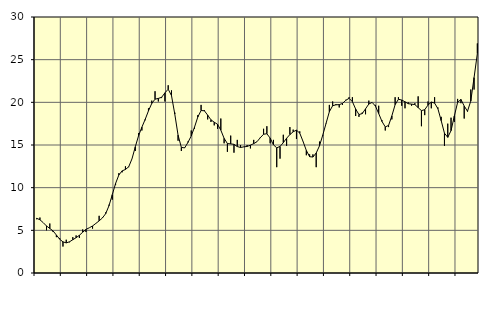
| Category | Piggar | Series 1 |
|---|---|---|
| nan | 6.3 | 6.41 |
| 87.0 | 6.5 | 6.24 |
| 87.0 | 5.9 | 5.9 |
| 87.0 | 5 | 5.51 |
| nan | 5.8 | 5.22 |
| 88.0 | 4.8 | 4.93 |
| 88.0 | 4.2 | 4.45 |
| 88.0 | 4.1 | 3.96 |
| nan | 3.1 | 3.65 |
| 89.0 | 3.9 | 3.53 |
| 89.0 | 3.6 | 3.66 |
| 89.0 | 4.2 | 3.9 |
| nan | 4.4 | 4.14 |
| 90.0 | 4.1 | 4.42 |
| 90.0 | 5.1 | 4.78 |
| 90.0 | 4.8 | 5.11 |
| nan | 5.3 | 5.3 |
| 91.0 | 5.2 | 5.51 |
| 91.0 | 5.8 | 5.81 |
| 91.0 | 6.7 | 6.11 |
| nan | 6.5 | 6.45 |
| 92.0 | 7.1 | 6.96 |
| 92.0 | 8 | 7.89 |
| 92.0 | 8.6 | 9.18 |
| nan | 10.3 | 10.49 |
| 93.0 | 11.7 | 11.49 |
| 93.0 | 11.8 | 11.97 |
| 93.0 | 12.5 | 12.13 |
| nan | 12.4 | 12.45 |
| 94.0 | 13.4 | 13.39 |
| 94.0 | 14.3 | 14.79 |
| 94.0 | 16.4 | 16.1 |
| nan | 16.7 | 17.09 |
| 95.0 | 17.9 | 18 |
| 95.0 | 19.3 | 19 |
| 95.0 | 20.2 | 19.87 |
| nan | 21.3 | 20.37 |
| 96.0 | 20.1 | 20.46 |
| 96.0 | 20.5 | 20.59 |
| 96.0 | 20.1 | 21.11 |
| nan | 22 | 21.54 |
| 97.0 | 21.4 | 20.79 |
| 97.0 | 18.8 | 18.63 |
| 97.0 | 15.5 | 16.15 |
| nan | 14.3 | 14.72 |
| 98.0 | 14.7 | 14.66 |
| 98.0 | 15.4 | 15.3 |
| 98.0 | 16.7 | 16.06 |
| nan | 16.9 | 17.09 |
| 99.0 | 18.5 | 18.28 |
| 99.0 | 19.7 | 19.04 |
| 99.0 | 19.1 | 19.01 |
| nan | 18 | 18.5 |
| 0.0 | 17.7 | 17.95 |
| 0.0 | 17.3 | 17.67 |
| 0.0 | 16.9 | 17.43 |
| nan | 18.1 | 16.74 |
| 1.0 | 15.2 | 15.78 |
| 1.0 | 14.2 | 15.17 |
| 1.0 | 16.1 | 15.13 |
| nan | 14.1 | 15.08 |
| 2.0 | 15.6 | 14.82 |
| 2.0 | 15 | 14.71 |
| 2.0 | 14.8 | 14.78 |
| nan | 15 | 14.83 |
| 3.0 | 14.6 | 14.98 |
| 3.0 | 15.6 | 15.16 |
| 3.0 | 15.4 | 15.39 |
| nan | 15.9 | 15.85 |
| 4.0 | 16.9 | 16.26 |
| 4.0 | 17.2 | 16.32 |
| 4.0 | 15.2 | 15.81 |
| nan | 15.6 | 15.02 |
| 5.0 | 12.4 | 14.67 |
| 5.0 | 13.4 | 14.83 |
| 5.0 | 16.2 | 15.27 |
| nan | 14.9 | 15.79 |
| 6.0 | 17.1 | 16.22 |
| 6.0 | 16.8 | 16.55 |
| 6.0 | 15.7 | 16.74 |
| nan | 16.6 | 16.39 |
| 7.0 | 15.4 | 15.42 |
| 7.0 | 13.8 | 14.36 |
| 7.0 | 13.9 | 13.63 |
| nan | 13.9 | 13.59 |
| 8.0 | 12.4 | 14.06 |
| 8.0 | 15.4 | 14.9 |
| 8.0 | 16.1 | 16.16 |
| nan | 17.5 | 17.54 |
| 9.0 | 19.7 | 18.9 |
| 9.0 | 20.1 | 19.6 |
| 9.0 | 19.8 | 19.71 |
| nan | 19.4 | 19.73 |
| 10.0 | 19.7 | 19.87 |
| 10.0 | 20.3 | 20.24 |
| 10.0 | 20.6 | 20.47 |
| nan | 20.6 | 20.08 |
| 11.0 | 18.4 | 19.21 |
| 11.0 | 18.3 | 18.57 |
| 11.0 | 18.8 | 18.68 |
| nan | 18.6 | 19.24 |
| 12.0 | 20.2 | 19.8 |
| 12.0 | 20 | 19.99 |
| 12.0 | 19.7 | 19.57 |
| nan | 19.6 | 18.69 |
| 13.0 | 17.9 | 17.76 |
| 13.0 | 16.7 | 17.12 |
| 13.0 | 17.1 | 17.29 |
| nan | 18 | 18.41 |
| 14.0 | 20.6 | 19.73 |
| 14.0 | 20.6 | 20.36 |
| 14.0 | 19.6 | 20.27 |
| nan | 19.3 | 20.06 |
| 15.0 | 20 | 19.84 |
| 15.0 | 19.6 | 19.79 |
| 15.0 | 19.9 | 19.74 |
| nan | 20.7 | 19.38 |
| 16.0 | 17.2 | 19.03 |
| 16.0 | 18.5 | 19.14 |
| 16.0 | 20.1 | 19.68 |
| nan | 19.3 | 20.03 |
| 17.0 | 20.6 | 19.91 |
| 17.0 | 19.4 | 19.26 |
| 17.0 | 18.3 | 17.86 |
| nan | 14.9 | 16.38 |
| 18.0 | 17.5 | 15.9 |
| 18.0 | 18.2 | 16.68 |
| 18.0 | 17.7 | 18.4 |
| nan | 20.4 | 19.99 |
| 19.0 | 19.9 | 20.34 |
| 19.0 | 18.1 | 19.57 |
| 19.0 | 18.9 | 18.96 |
| nan | 21.5 | 20.15 |
| 20.0 | 21.5 | 22.9 |
| 20.0 | 26.9 | 25.72 |